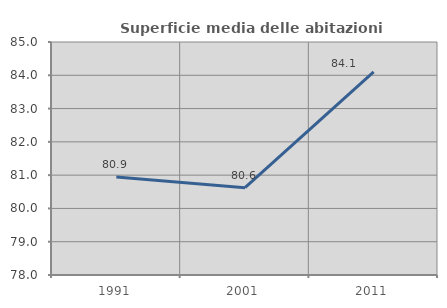
| Category | Superficie media delle abitazioni occupate |
|---|---|
| 1991.0 | 80.944 |
| 2001.0 | 80.623 |
| 2011.0 | 84.101 |